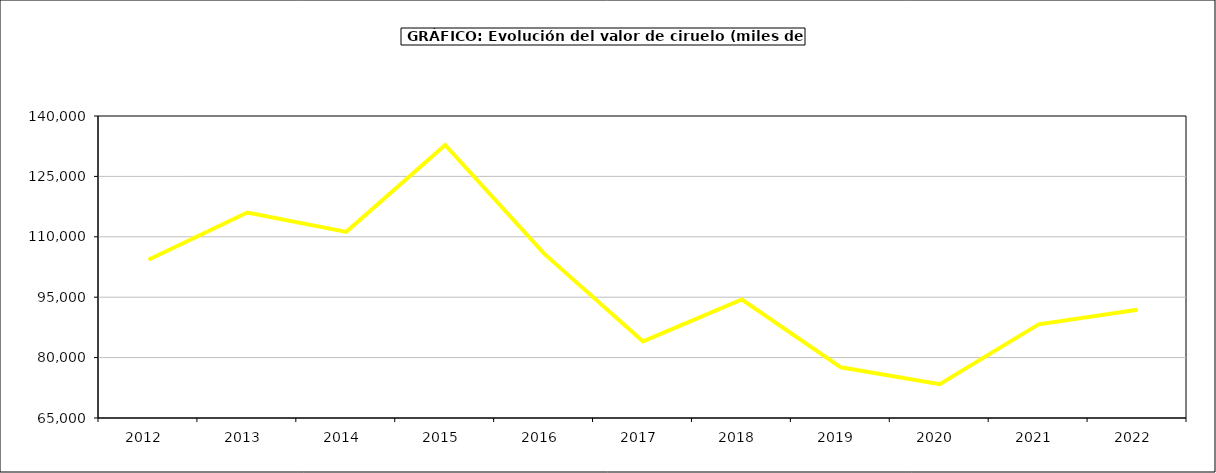
| Category | valor Ciruelo |
|---|---|
| 2012.0 | 104288.297 |
| 2013.0 | 116027.366 |
| 2014.0 | 111223.369 |
| 2015.0 | 132808 |
| 2016.0 | 105821 |
| 2017.0 | 84025.67 |
| 2018.0 | 94421.725 |
| 2019.0 | 77582.545 |
| 2020.0 | 73413.397 |
| 2021.0 | 88268.393 |
| 2022.0 | 91880.552 |